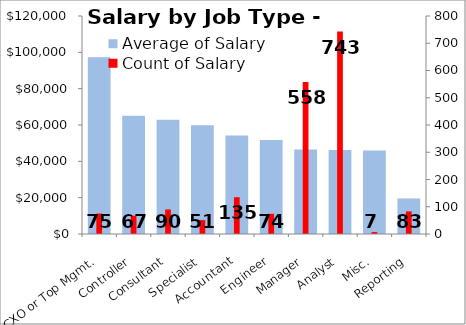
| Category | Average of Salary |
|---|---|
| CXO or Top Mgmt. | 97265.876 |
| Controller | 65103.929 |
| Consultant | 62950.733 |
| Specialist | 59812.969 |
| Accountant | 54196.441 |
| Engineer | 51715.151 |
| Manager | 46488.241 |
| Analyst | 46295.769 |
| Misc. | 45952.334 |
| Reporting | 19574.159 |